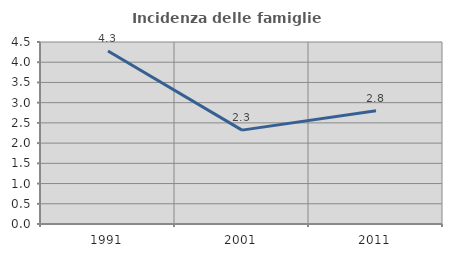
| Category | Incidenza delle famiglie numerose |
|---|---|
| 1991.0 | 4.278 |
| 2001.0 | 2.321 |
| 2011.0 | 2.798 |